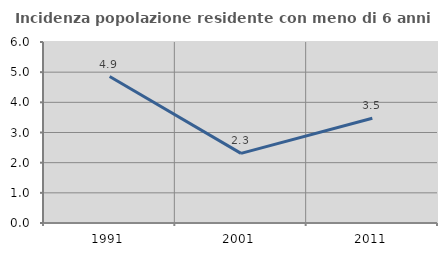
| Category | Incidenza popolazione residente con meno di 6 anni |
|---|---|
| 1991.0 | 4.854 |
| 2001.0 | 2.309 |
| 2011.0 | 3.471 |